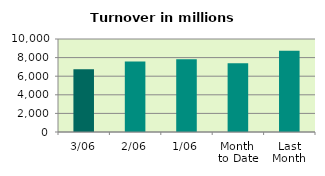
| Category | Series 0 |
|---|---|
| 3/06 | 6744.619 |
| 2/06 | 7583.05 |
| 1/06 | 7825.103 |
| Month 
to Date | 7384.258 |
| Last
Month | 8745.898 |